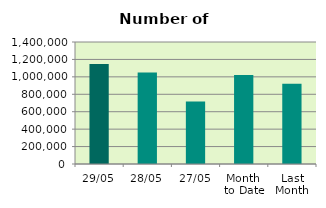
| Category | Series 0 |
|---|---|
| 29/05 | 1146978 |
| 28/05 | 1050408 |
| 27/05 | 718036 |
| Month 
to Date | 1021451.3 |
| Last
Month | 921109.3 |